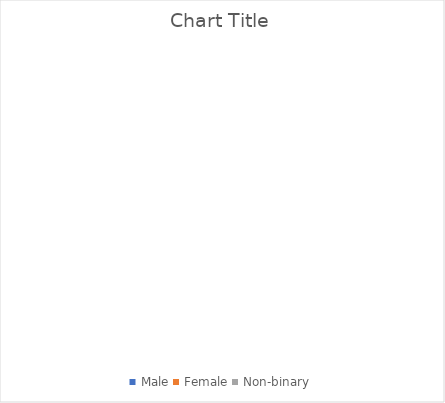
| Category | Series 0 |
|---|---|
| Male | 0 |
| Female | 0 |
| Non-binary | 0 |